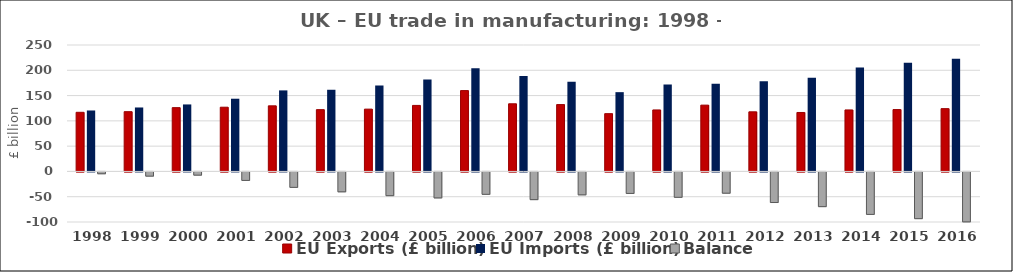
| Category | EU Exports (£ billion) | EU Imports (£ billion) | Balance |
|---|---|---|---|
| 1998 | 116.901 | 120.519 | -3.618 |
| 1999 | 118.137 | 126.449 | -8.312 |
| 2000 | 126.12 | 132.472 | -6.352 |
| 2001 | 126.994 | 143.778 | -16.784 |
| 2002 | 129.714 | 160.242 | -30.527 |
| 2003 | 122.166 | 161.486 | -39.32 |
| 2004 | 123.194 | 170.128 | -46.934 |
| 2005 | 130.522 | 181.893 | -51.37 |
| 2006 | 159.848 | 204.129 | -44.281 |
| 2007 | 133.764 | 188.548 | -54.784 |
| 2008 | 132.211 | 177.538 | -45.328 |
| 2009 | 114.234 | 156.753 | -42.519 |
| 2010 | 121.567 | 171.749 | -50.182 |
| 2011 | 131.096 | 173.156 | -42.06 |
| 2012 | 117.868 | 178.381 | -60.513 |
| 2013 | 116.579 | 185.206 | -68.627 |
| 2014 | 121.573 | 205.564 | -83.991 |
| 2015 | 122.308 | 214.682 | -92.374 |
| 2016 | 124.139 | 222.884 | -98.745 |